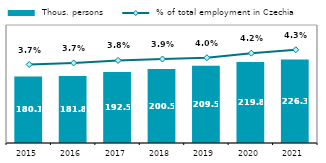
| Category |  Thous. persons |
|---|---|
| 2015.0 | 180.104 |
| 2016.0 | 181.802 |
| 2017.0 | 192.542 |
| 2018.0 | 200.508 |
| 2019.0 | 209.525 |
| 2020.0 | 219.767 |
| 2021.0 | 226.275 |